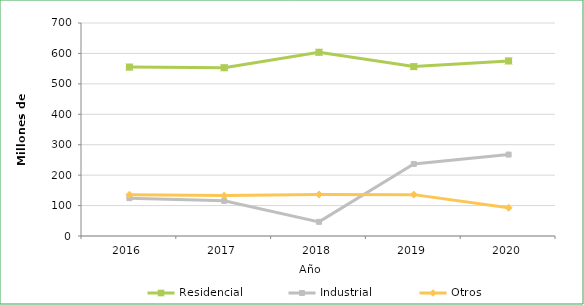
| Category | Residencial | Industrial | Otros |
|---|---|---|---|
| 2016.0 | 555088 | 124304 | 135761 |
| 2017.0 | 552996 | 115526 | 132762 |
| 2018.0 | 603793 | 46525 | 136338 |
| 2019.0 | 556693 | 236684 | 135930 |
| 2020.0 | 575298 | 267634 | 92600 |